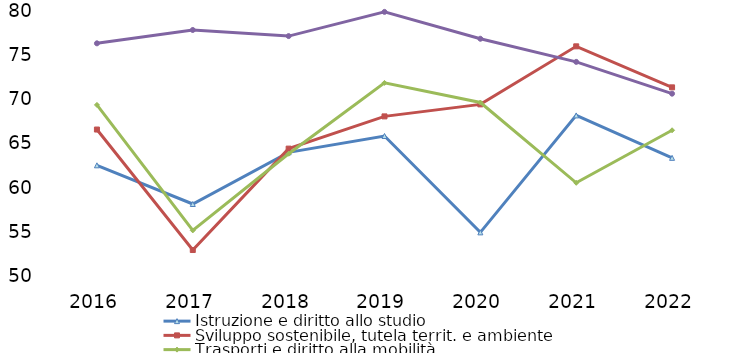
| Category | Istruzione e diritto allo studio | Sviluppo sostenibile, tutela territ. e ambiente | Trasporti e diritto alla mobilità | Diritti sociali, politiche sociali e famiglia |
|---|---|---|---|---|
| 2016.0 | 62.53 | 66.58 | 69.37 | 76.34 |
| 2017.0 | 58.15 | 52.94 | 55.16 | 77.85 |
| 2018.0 | 64 | 64.42 | 63.84 | 77.16 |
| 2019.0 | 65.85 | 68.07 | 71.86 | 79.9 |
| 2020.0 | 54.94 | 69.43 | 69.64 | 76.86 |
| 2021.0 | 68.18 | 76 | 60.55 | 74.24 |
| 2022.0 | 63.378 | 71.357 | 66.497 | 70.64 |